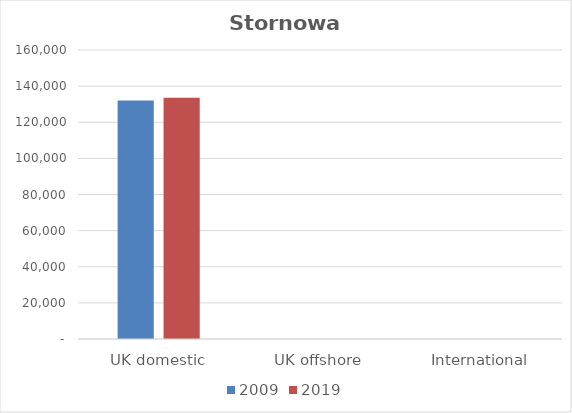
| Category | 2009 | 2019 |
|---|---|---|
| UK domestic | 132001 | 133595 |
| UK offshore | 0 | 0 |
| International | 0 | 0 |